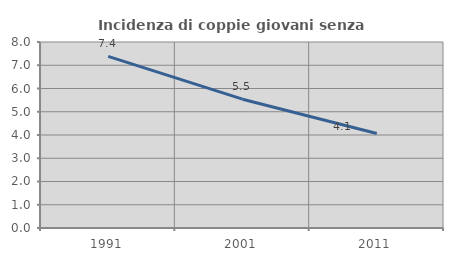
| Category | Incidenza di coppie giovani senza figli |
|---|---|
| 1991.0 | 7.384 |
| 2001.0 | 5.54 |
| 2011.0 | 4.066 |